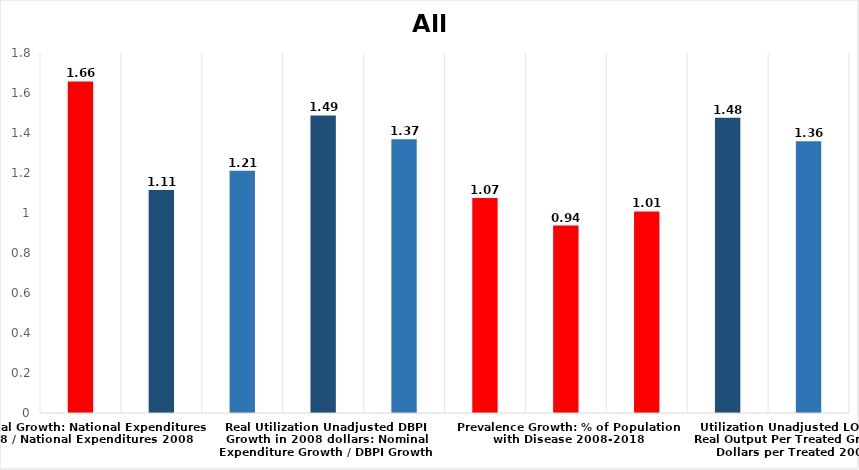
| Category | All Disease |
|---|---|
| Nominal Growth: National Expenditures 2018 / National Expenditures 2008 | 1.658 |
| Price Index Growth: Yearly All Disease Utilization Unadjusted Price Index with Adjusted Quantity (DBPI) 2008-2018 | 1.114 |
| Price Index Growth: Yearly All Disease Utilization Unadjusted Price Index with Fixed Quantity (LOWE) 2008-2018 | 1.211 |
| Real Utilization Unadjusted DBPI Growth in 2008 dollars: Nominal Expenditure Growth / DBPI Growth | 1.488 |
| Real Utilization Unadjusted LOWE Growth in 2008 dollars: Nominal Expenditure Growth / LOWE Index Growth | 1.369 |
| Population Growth Rate: US Population 2018 / US Population 2008 | 1.075 |
| Prevalence Growth: % of Population with Disease 2008-2018 | 0.937 |
| Growth in Population Treated for Disease 2008-2018 | 1.008 |
| Utilization Unadjusted DBPI- Real Output Per Treated Growth: Real Dollars per Treated 2008-2018 | 1.476 |
| Utilization Unadjusted LOWE Index - Real Output Per Treated Growth: Real Dollars per Treated 2008-2018 | 1.359 |